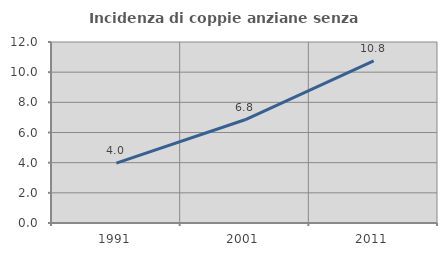
| Category | Incidenza di coppie anziane senza figli  |
|---|---|
| 1991.0 | 3.974 |
| 2001.0 | 6.843 |
| 2011.0 | 10.755 |